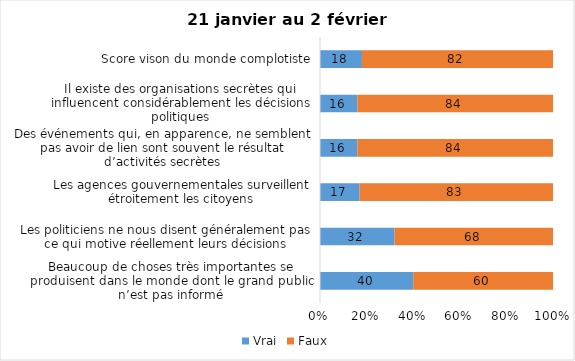
| Category | Vrai | Faux |
|---|---|---|
| Beaucoup de choses très importantes se produisent dans le monde dont le grand public n’est pas informé | 40 | 60 |
| Les politiciens ne nous disent généralement pas ce qui motive réellement leurs décisions | 32 | 68 |
| Les agences gouvernementales surveillent étroitement les citoyens | 17 | 83 |
| Des événements qui, en apparence, ne semblent pas avoir de lien sont souvent le résultat d’activités secrètes | 16 | 84 |
| Il existe des organisations secrètes qui influencent considérablement les décisions politiques | 16 | 84 |
| Score vison du monde complotiste | 18 | 82 |